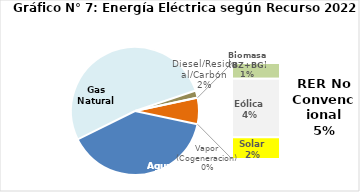
| Category | Series 0 |
|---|---|
| Agua | 1958.599 |
| Gas Natural | 2596.043 |
| Diesel/Residual/Carbón | 90.059 |
| Vapor (Cogeneracion) | 1.87 |
| Biomasa (BZ+BG) | 54.58 |
| Eólica | 202.557 |
| Solar | 75.047 |